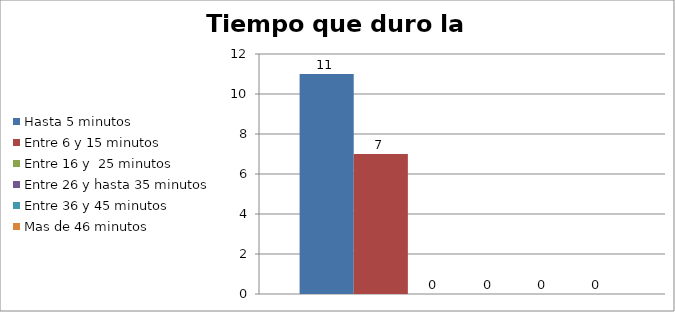
| Category | Hasta 5 minutos | Entre 6 y 15 minutos  | Entre 16 y  25 minutos | Entre 26 y hasta 35 minutos | Entre 36 y 45 minutos  | Mas de 46 minutos |
|---|---|---|---|---|---|---|
| 0 | 11 | 7 | 0 | 0 | 0 | 0 |